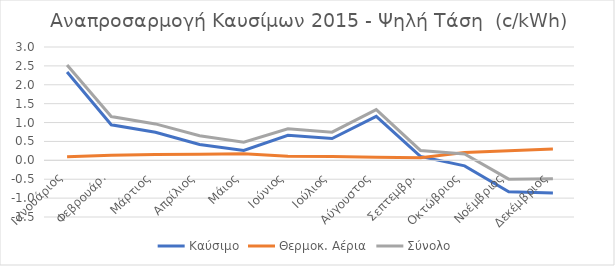
| Category | Καύσιμο | Θερμοκ. Αέρια | Σύνολο |
|---|---|---|---|
| Ιανουάριος | 2.34 | 0.098 | 2.522 |
| Φεβρουάρ. | 0.94 | 0.137 | 1.158 |
| Μάρτιος | 0.741 | 0.156 | 0.964 |
| Απρίλιος | 0.419 | 0.16 | 0.651 |
| Μάιος | 0.262 | 0.174 | 0.481 |
| Ιούνιος | 0.665 | 0.11 | 0.835 |
| Ιούλιος | 0.576 | 0.101 | 0.745 |
| Αύγουστος | 1.163 | 0.08 | 1.343 |
| Σεπτεμβρ. | 0.102 | 0.068 | 0.262 |
| Οκτώβριος | -0.146 | 0.208 | 0.167 |
| Νοέμβριος | -0.832 | 0.251 | -0.498 |
| Δεκέμβριος | -0.864 | 0.302 | -0.49 |